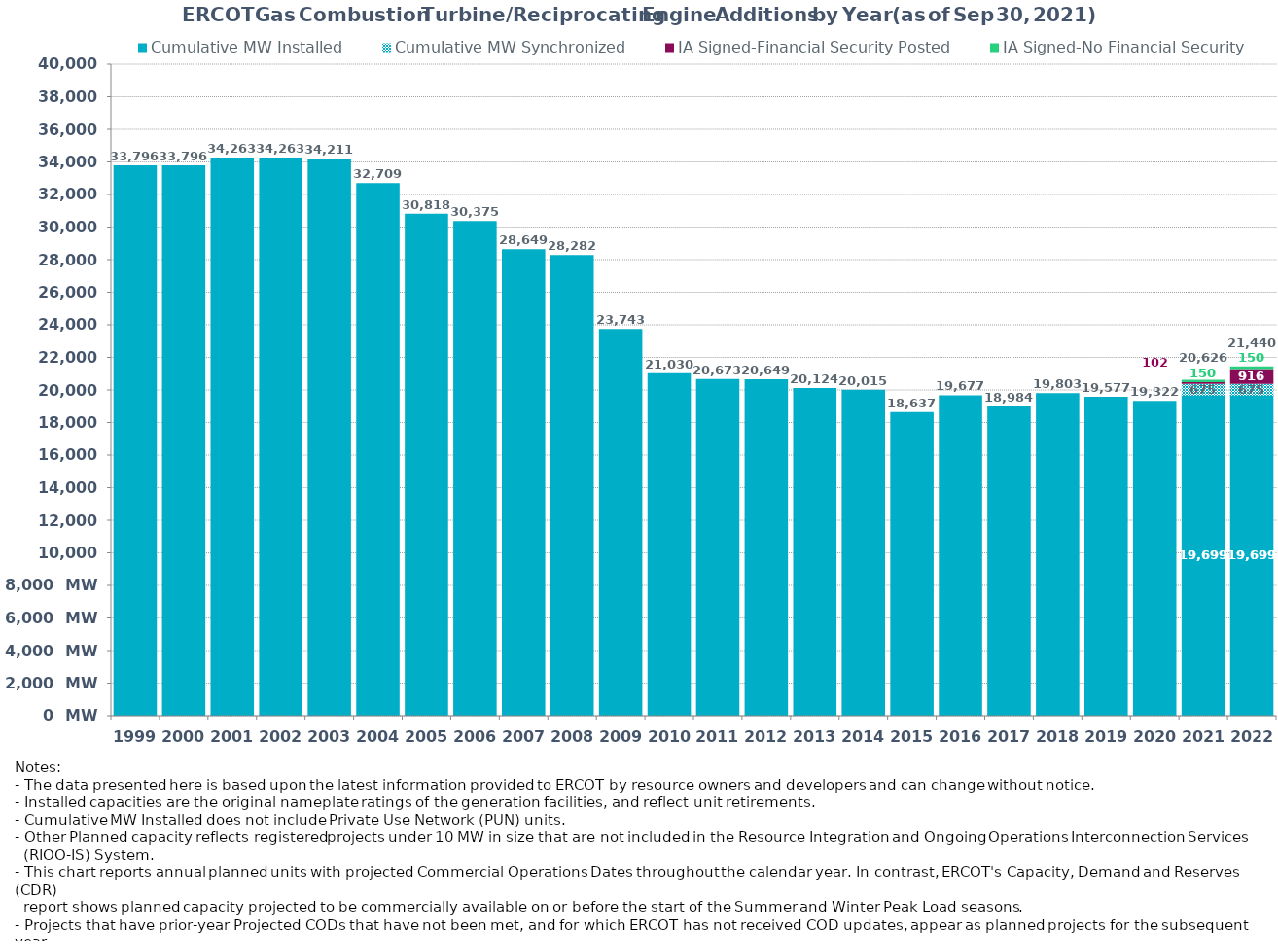
| Category | Cumulative MW Installed | Cumulative MW Synchronized | IA Signed-Financial Security Posted  | IA Signed-No Financial Security  | Other Planned | Cumulative Installed and Planned |
|---|---|---|---|---|---|---|
| 1999.0 | 33796.03 | 0 | 0 | 0 | 0 | 33796.03 |
| 2000.0 | 33796.03 | 0 | 0 | 0 | 0 | 33796.03 |
| 2001.0 | 34262.59 | 0 | 0 | 0 | 0 | 34262.59 |
| 2002.0 | 34262.59 | 0 | 0 | 0 | 0 | 34262.59 |
| 2003.0 | 34210.59 | 0 | 0 | 0 | 0 | 34210.59 |
| 2004.0 | 32708.69 | 0 | 0 | 0 | 0 | 32708.69 |
| 2005.0 | 30818 | 0 | 0 | 0 | 0 | 30818 |
| 2006.0 | 30375 | 0 | 0 | 0 | 0 | 30375 |
| 2007.0 | 28649 | 0 | 0 | 0 | 0 | 28649 |
| 2008.0 | 28282 | 0 | 0 | 0 | 0 | 28282 |
| 2009.0 | 23743.29 | 0 | 0 | 0 | 0 | 23743.29 |
| 2010.0 | 21030.17 | 0 | 0 | 0 | 0 | 21030.17 |
| 2011.0 | 20673.47 | 0 | 0 | 0 | 0 | 20673.47 |
| 2012.0 | 20649.47 | 0 | 0 | 0 | 0 | 20649.47 |
| 2013.0 | 20124.47 | 0 | 0 | 0 | 0 | 20124.47 |
| 2014.0 | 20015.47 | 0 | 0 | 0 | 0 | 20015.47 |
| 2015.0 | 18636.67 | 0 | 0 | 0 | 0 | 18636.67 |
| 2016.0 | 19677.05 | 0 | 0 | 0 | 0 | 19677.05 |
| 2017.0 | 18984.19 | 0 | 0 | 0 | 0 | 18984.19 |
| 2018.0 | 19803.35 | 0 | 0 | 0 | 0 | 19803.35 |
| 2019.0 | 19577.05 | 0 | 0 | 0 | 0 | 19577.05 |
| 2020.0 | 19322.4 | 0 | 0 | 0 | 0 | 19322.4 |
| 2021.0 | 19699.34 | 675 | 102 | 150 | 0 | 20626.34 |
| 2022.0 | 19699.34 | 675 | 916 | 150 | 0 | 21440.34 |